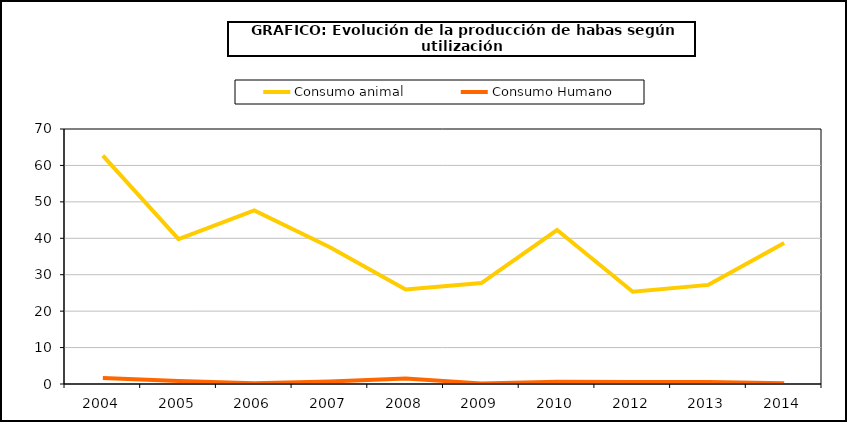
| Category | Consumo animal | Consumo Humano |
|---|---|---|
| 2004 | 62.697 | 1.655 |
| 2005 | 39.775 | 0.81 |
| 2006 | 47.635 | 0.209 |
| 2007 | 37.523 | 0.661 |
| 2008 | 25.955 | 1.505 |
| 2009 | 27.701 | 0.165 |
| 2010 | 42.262 | 0.62 |
| 2012 | 25.317 | 0.571 |
| 2013 | 27.212 | 0.547 |
| 2014 | 38.703 | 0.238 |